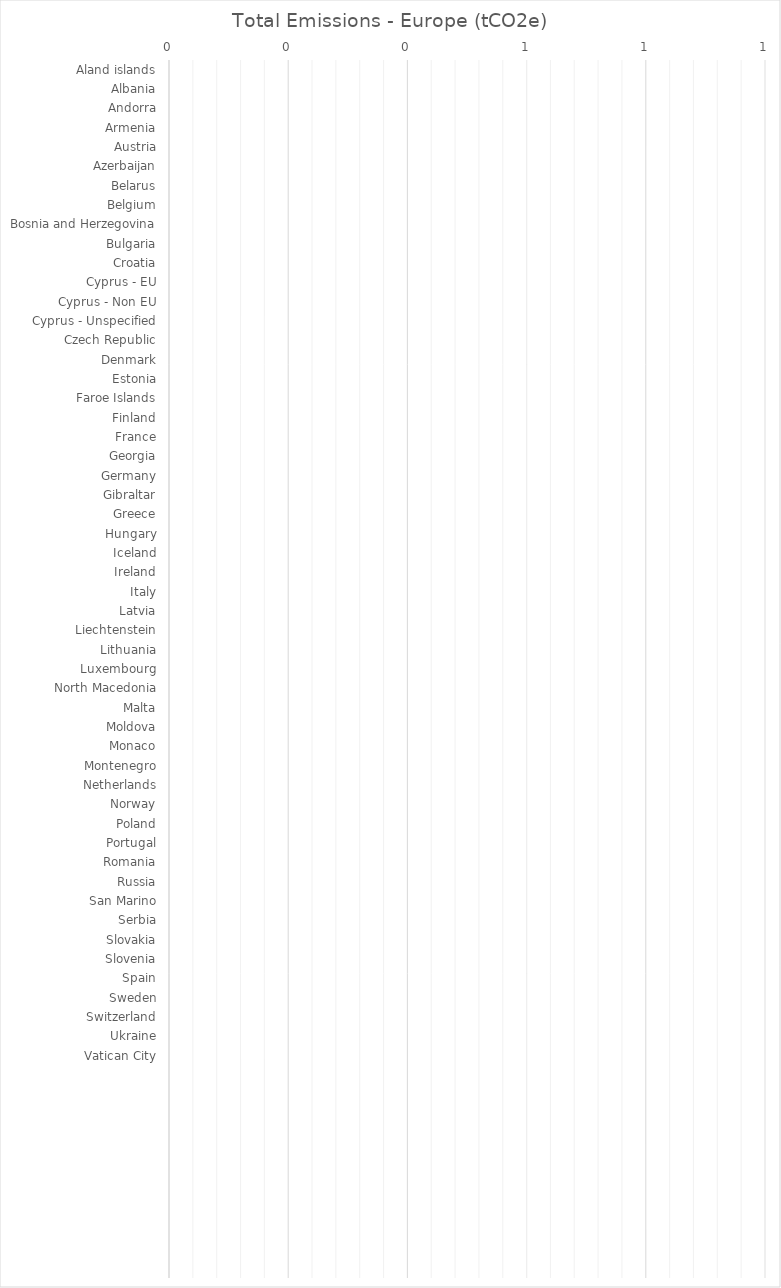
| Category | Total Emissions - Europe (tCO2e) |
|---|---|
| Aland islands | 0 |
| Albania | 0 |
| Andorra | 0 |
| Armenia | 0 |
| Austria | 0 |
| Azerbaijan | 0 |
| Belarus | 0 |
| Belgium | 0 |
| Bosnia and Herzegovina | 0 |
| Bulgaria | 0 |
| Croatia | 0 |
| Cyprus - EU | 0 |
| Cyprus - Non EU | 0 |
| Cyprus - Unspecified | 0 |
| Czech Republic | 0 |
| Denmark | 0 |
| Estonia | 0 |
| Faroe Islands | 0 |
| Finland | 0 |
| France | 0 |
| Georgia | 0 |
| Germany | 0 |
| Gibraltar | 0 |
| Greece | 0 |
| Hungary | 0 |
| Iceland | 0 |
| Ireland | 0 |
| Italy | 0 |
| Latvia | 0 |
| Liechtenstein | 0 |
| Lithuania | 0 |
| Luxembourg | 0 |
| North Macedonia | 0 |
| Malta | 0 |
| Moldova | 0 |
| Monaco | 0 |
| Montenegro | 0 |
| Netherlands | 0 |
| Norway | 0 |
| Poland | 0 |
| Portugal | 0 |
| Romania | 0 |
| Russia | 0 |
| San Marino | 0 |
| Serbia | 0 |
| Slovakia | 0 |
| Slovenia | 0 |
| Spain | 0 |
| Sweden | 0 |
| Switzerland | 0 |
| Ukraine | 0 |
| Vatican City | 0 |